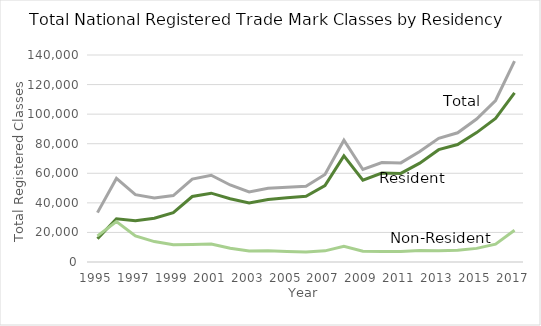
| Category | Resident Applications2 | Non-Resident Applications | Total |
|---|---|---|---|
| 1995.0 | 15729 | 17671 | 33400 |
| 1996.0 | 29196 | 27335 | 56531 |
| 1997.0 | 27897 | 17670 | 45567 |
| 1998.0 | 29563 | 13807 | 43370 |
| 1999.0 | 33309 | 11623 | 44932 |
| 2000.0 | 44292 | 11769 | 56061 |
| 2001.0 | 46544 | 12140 | 58684 |
| 2002.0 | 42800 | 9281 | 52081 |
| 2003.0 | 39864 | 7468 | 47332 |
| 2004.0 | 42318 | 7595 | 49913 |
| 2005.0 | 43412 | 7143 | 50555 |
| 2006.0 | 44459 | 6817 | 51276 |
| 2007.0 | 51675 | 7542 | 59217 |
| 2008.0 | 71802 | 10607 | 82409 |
| 2009.0 | 55287 | 7281 | 62568 |
| 2010.0 | 60115 | 7129 | 67244 |
| 2011.0 | 59916 | 7111 | 67027 |
| 2012.0 | 66887 | 7820 | 74707 |
| 2013.0 | 75975 | 7649 | 83624 |
| 2014.0 | 79464 | 7908 | 87372 |
| 2015.0 | 87515 | 9211 | 96726 |
| 2016.0 | 97168 | 12051 | 109219 |
| 2017.0 | 114334 | 21488 | 135822 |